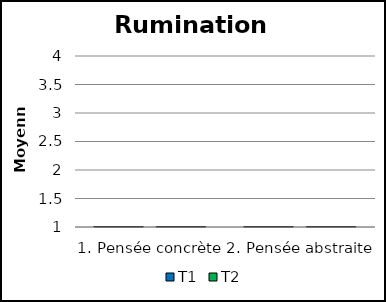
| Category | T1 | T2 |
|---|---|---|
| 1. Pensée concrète | 0 | 0 |
| 2. Pensée abstraite | 0 | 0 |